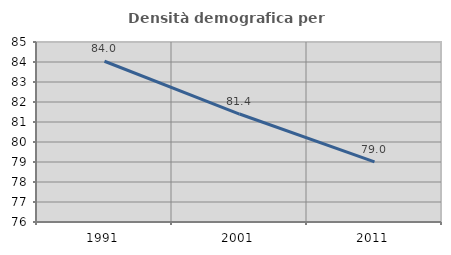
| Category | Densità demografica |
|---|---|
| 1991.0 | 84.037 |
| 2001.0 | 81.399 |
| 2011.0 | 79.002 |